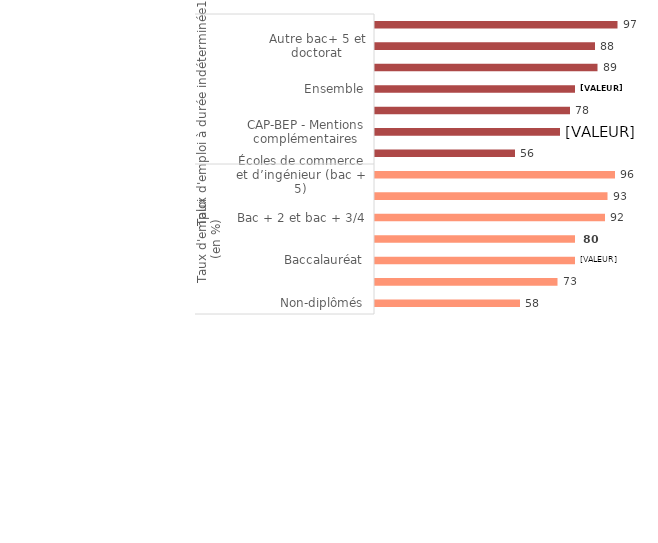
| Category | Series 0 |
|---|---|
| 0 | 58 |
| 1 | 73 |
| 2 | 80 |
| 3 | 80 |
| 4 | 92 |
| 5 | 93 |
| 6 | 96 |
| 7 | 56 |
| 8 | 74 |
| 9 | 78 |
| 10 | 80 |
| 11 | 89 |
| 12 | 88 |
| 13 | 97 |